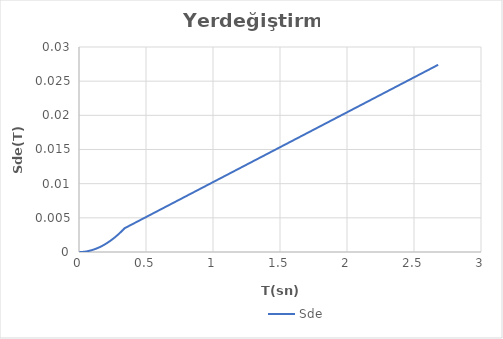
| Category | Sde |
|---|---|
| 0.0 | 0 |
| 0.004 | 0 |
| 0.008 | 0 |
| 0.012 | 0 |
| 0.016 | 0 |
| 0.02 | 0 |
| 0.024 | 0 |
| 0.028 | 0 |
| 0.032 | 0 |
| 0.036000000000000004 | 0 |
| 0.04000000000000001 | 0 |
| 0.04400000000000001 | 0 |
| 0.048000000000000015 | 0 |
| 0.05200000000000002 | 0 |
| 0.05600000000000002 | 0 |
| 0.060000000000000026 | 0 |
| 0.06400000000000003 | 0 |
| 0.06820486815415822 | 0 |
| 0.07200000000000004 | 0 |
| 0.07600000000000004 | 0 |
| 0.08000000000000004 | 0 |
| 0.08400000000000005 | 0 |
| 0.08800000000000005 | 0 |
| 0.09200000000000005 | 0 |
| 0.09600000000000006 | 0 |
| 0.10000000000000006 | 0 |
| 0.10400000000000006 | 0 |
| 0.10800000000000007 | 0 |
| 0.11200000000000007 | 0 |
| 0.11600000000000008 | 0 |
| 0.12000000000000008 | 0 |
| 0.12400000000000008 | 0 |
| 0.12800000000000009 | 0 |
| 0.1320000000000001 | 0.001 |
| 0.1360000000000001 | 0.001 |
| 0.1400000000000001 | 0.001 |
| 0.1440000000000001 | 0.001 |
| 0.1480000000000001 | 0.001 |
| 0.1520000000000001 | 0.001 |
| 0.1560000000000001 | 0.001 |
| 0.16000000000000011 | 0.001 |
| 0.16400000000000012 | 0.001 |
| 0.16800000000000012 | 0.001 |
| 0.17200000000000013 | 0.001 |
| 0.17600000000000013 | 0.001 |
| 0.18000000000000013 | 0.001 |
| 0.18400000000000014 | 0.001 |
| 0.18800000000000014 | 0.001 |
| 0.19200000000000014 | 0.001 |
| 0.19600000000000015 | 0.001 |
| 0.20000000000000015 | 0.001 |
| 0.20400000000000015 | 0.001 |
| 0.20800000000000016 | 0.001 |
| 0.21200000000000016 | 0.001 |
| 0.21600000000000016 | 0.001 |
| 0.22000000000000017 | 0.001 |
| 0.22400000000000017 | 0.002 |
| 0.22800000000000017 | 0.002 |
| 0.23200000000000018 | 0.002 |
| 0.23600000000000018 | 0.002 |
| 0.24000000000000019 | 0.002 |
| 0.2440000000000002 | 0.002 |
| 0.2480000000000002 | 0.002 |
| 0.25200000000000017 | 0.002 |
| 0.25600000000000017 | 0.002 |
| 0.2600000000000002 | 0.002 |
| 0.2640000000000002 | 0.002 |
| 0.2680000000000002 | 0.002 |
| 0.2720000000000002 | 0.002 |
| 0.2760000000000002 | 0.002 |
| 0.2800000000000002 | 0.002 |
| 0.2840000000000002 | 0.002 |
| 0.2880000000000002 | 0.002 |
| 0.2920000000000002 | 0.003 |
| 0.2960000000000002 | 0.003 |
| 0.3000000000000002 | 0.003 |
| 0.3040000000000002 | 0.003 |
| 0.3080000000000002 | 0.003 |
| 0.3120000000000002 | 0.003 |
| 0.3160000000000002 | 0.003 |
| 0.32000000000000023 | 0.003 |
| 0.32400000000000023 | 0.003 |
| 0.32800000000000024 | 0.003 |
| 0.33200000000000024 | 0.003 |
| 0.33600000000000024 | 0.003 |
| 0.3410243407707911 | 0.003 |
| 0.34400000000000025 | 0.004 |
| 0.34800000000000025 | 0.004 |
| 0.35200000000000026 | 0.004 |
| 0.35600000000000026 | 0.004 |
| 0.36000000000000026 | 0.004 |
| 0.36400000000000027 | 0.004 |
| 0.36800000000000027 | 0.004 |
| 0.3720000000000003 | 0.004 |
| 0.3760000000000003 | 0.004 |
| 0.3800000000000003 | 0.004 |
| 0.3840000000000003 | 0.004 |
| 0.3880000000000003 | 0.004 |
| 0.3920000000000003 | 0.004 |
| 0.3960000000000003 | 0.004 |
| 0.4000000000000003 | 0.004 |
| 0.4040000000000003 | 0.004 |
| 0.4080000000000003 | 0.004 |
| 0.4120000000000003 | 0.004 |
| 0.4160000000000003 | 0.004 |
| 0.4200000000000003 | 0.004 |
| 0.4240000000000003 | 0.004 |
| 0.4280000000000003 | 0.004 |
| 0.43200000000000033 | 0.004 |
| 0.43600000000000033 | 0.004 |
| 0.44000000000000034 | 0.004 |
| 0.44400000000000034 | 0.005 |
| 0.44800000000000034 | 0.005 |
| 0.45200000000000035 | 0.005 |
| 0.45600000000000035 | 0.005 |
| 0.46000000000000035 | 0.005 |
| 0.46400000000000036 | 0.005 |
| 0.46800000000000036 | 0.005 |
| 0.47200000000000036 | 0.005 |
| 0.47600000000000037 | 0.005 |
| 0.48000000000000037 | 0.005 |
| 0.4840000000000004 | 0.005 |
| 0.4880000000000004 | 0.005 |
| 0.4920000000000004 | 0.005 |
| 0.4960000000000004 | 0.005 |
| 0.5000000000000003 | 0.005 |
| 0.5040000000000003 | 0.005 |
| 0.5080000000000003 | 0.005 |
| 0.5120000000000003 | 0.005 |
| 0.5160000000000003 | 0.005 |
| 0.5200000000000004 | 0.005 |
| 0.5240000000000004 | 0.005 |
| 0.5280000000000004 | 0.005 |
| 0.5320000000000004 | 0.005 |
| 0.5360000000000004 | 0.005 |
| 0.5400000000000004 | 0.006 |
| 0.5440000000000004 | 0.006 |
| 0.5480000000000004 | 0.006 |
| 0.5520000000000004 | 0.006 |
| 0.5560000000000004 | 0.006 |
| 0.5600000000000004 | 0.006 |
| 0.5640000000000004 | 0.006 |
| 0.5680000000000004 | 0.006 |
| 0.5720000000000004 | 0.006 |
| 0.5760000000000004 | 0.006 |
| 0.5800000000000004 | 0.006 |
| 0.5840000000000004 | 0.006 |
| 0.5880000000000004 | 0.006 |
| 0.5920000000000004 | 0.006 |
| 0.5960000000000004 | 0.006 |
| 0.6000000000000004 | 0.006 |
| 0.6040000000000004 | 0.006 |
| 0.6080000000000004 | 0.006 |
| 0.6120000000000004 | 0.006 |
| 0.6160000000000004 | 0.006 |
| 0.6200000000000004 | 0.006 |
| 0.6240000000000004 | 0.006 |
| 0.6280000000000004 | 0.006 |
| 0.6320000000000005 | 0.006 |
| 0.6360000000000005 | 0.007 |
| 0.6400000000000005 | 0.007 |
| 0.6440000000000005 | 0.007 |
| 0.6480000000000005 | 0.007 |
| 0.6520000000000005 | 0.007 |
| 0.6560000000000005 | 0.007 |
| 0.6600000000000005 | 0.007 |
| 0.6640000000000005 | 0.007 |
| 0.6680000000000005 | 0.007 |
| 0.6720000000000005 | 0.007 |
| 0.6760000000000005 | 0.007 |
| 0.6800000000000005 | 0.007 |
| 0.6840000000000005 | 0.007 |
| 0.6880000000000005 | 0.007 |
| 0.6920000000000005 | 0.007 |
| 0.6960000000000005 | 0.007 |
| 0.7000000000000005 | 0.007 |
| 0.7040000000000005 | 0.007 |
| 0.7080000000000005 | 0.007 |
| 0.7120000000000005 | 0.007 |
| 0.7160000000000005 | 0.007 |
| 0.7200000000000005 | 0.007 |
| 0.7240000000000005 | 0.007 |
| 0.7280000000000005 | 0.007 |
| 0.7320000000000005 | 0.007 |
| 0.7360000000000005 | 0.008 |
| 0.7400000000000005 | 0.008 |
| 0.7440000000000005 | 0.008 |
| 0.7480000000000006 | 0.008 |
| 0.7520000000000006 | 0.008 |
| 0.7560000000000006 | 0.008 |
| 0.7600000000000006 | 0.008 |
| 0.7640000000000006 | 0.008 |
| 0.7680000000000006 | 0.008 |
| 0.7720000000000006 | 0.008 |
| 0.7760000000000006 | 0.008 |
| 0.7800000000000006 | 0.008 |
| 0.7840000000000006 | 0.008 |
| 0.7880000000000006 | 0.008 |
| 0.7920000000000006 | 0.008 |
| 0.7960000000000006 | 0.008 |
| 0.8000000000000006 | 0.008 |
| 0.8040000000000006 | 0.008 |
| 0.8080000000000006 | 0.008 |
| 0.8120000000000006 | 0.008 |
| 0.8160000000000006 | 0.008 |
| 0.8200000000000006 | 0.008 |
| 0.8240000000000006 | 0.008 |
| 0.8280000000000006 | 0.008 |
| 0.8320000000000006 | 0.009 |
| 0.8360000000000006 | 0.009 |
| 0.8400000000000006 | 0.009 |
| 0.8440000000000006 | 0.009 |
| 0.8480000000000006 | 0.009 |
| 0.8520000000000006 | 0.009 |
| 0.8560000000000006 | 0.009 |
| 0.8600000000000007 | 0.009 |
| 0.8640000000000007 | 0.009 |
| 0.8680000000000007 | 0.009 |
| 0.8720000000000007 | 0.009 |
| 0.8760000000000007 | 0.009 |
| 0.8800000000000007 | 0.009 |
| 0.8840000000000007 | 0.009 |
| 0.8880000000000007 | 0.009 |
| 0.8920000000000007 | 0.009 |
| 0.8960000000000007 | 0.009 |
| 0.9000000000000007 | 0.009 |
| 0.9040000000000007 | 0.009 |
| 0.9080000000000007 | 0.009 |
| 0.9120000000000007 | 0.009 |
| 0.9160000000000007 | 0.009 |
| 0.9200000000000007 | 0.009 |
| 0.9240000000000007 | 0.009 |
| 0.9280000000000007 | 0.009 |
| 0.9320000000000007 | 0.01 |
| 0.9360000000000007 | 0.01 |
| 0.9400000000000007 | 0.01 |
| 0.9440000000000007 | 0.01 |
| 0.9480000000000007 | 0.01 |
| 0.9520000000000007 | 0.01 |
| 0.9560000000000007 | 0.01 |
| 0.9600000000000007 | 0.01 |
| 0.9640000000000007 | 0.01 |
| 0.9680000000000007 | 0.01 |
| 0.9720000000000008 | 0.01 |
| 0.9760000000000008 | 0.01 |
| 0.9800000000000008 | 0.01 |
| 0.9840000000000008 | 0.01 |
| 0.9880000000000008 | 0.01 |
| 0.9920000000000008 | 0.01 |
| 0.9960000000000008 | 0.01 |
| 1.0 | 0.01 |
| 1.0040000000000007 | 0.01 |
| 1.0080000000000007 | 0.01 |
| 1.0120000000000007 | 0.01 |
| 1.0160000000000007 | 0.01 |
| 1.0200000000000007 | 0.01 |
| 1.0240000000000007 | 0.01 |
| 1.0280000000000007 | 0.011 |
| 1.0320000000000007 | 0.011 |
| 1.0360000000000007 | 0.011 |
| 1.0400000000000007 | 0.011 |
| 1.0440000000000007 | 0.011 |
| 1.0480000000000007 | 0.011 |
| 1.0520000000000007 | 0.011 |
| 1.0560000000000007 | 0.011 |
| 1.0600000000000007 | 0.011 |
| 1.0640000000000007 | 0.011 |
| 1.0680000000000007 | 0.011 |
| 1.0720000000000007 | 0.011 |
| 1.0760000000000007 | 0.011 |
| 1.0800000000000007 | 0.011 |
| 1.0840000000000007 | 0.011 |
| 1.0880000000000007 | 0.011 |
| 1.0920000000000007 | 0.011 |
| 1.0960000000000008 | 0.011 |
| 1.1000000000000008 | 0.011 |
| 1.1040000000000008 | 0.011 |
| 1.1080000000000008 | 0.011 |
| 1.1120000000000008 | 0.011 |
| 1.1160000000000008 | 0.011 |
| 1.1200000000000008 | 0.011 |
| 1.1240000000000008 | 0.011 |
| 1.1280000000000008 | 0.012 |
| 1.1320000000000008 | 0.012 |
| 1.1360000000000008 | 0.012 |
| 1.1400000000000008 | 0.012 |
| 1.1440000000000008 | 0.012 |
| 1.1480000000000008 | 0.012 |
| 1.1520000000000008 | 0.012 |
| 1.1560000000000008 | 0.012 |
| 1.1600000000000008 | 0.012 |
| 1.1640000000000008 | 0.012 |
| 1.1680000000000008 | 0.012 |
| 1.1720000000000008 | 0.012 |
| 1.1760000000000008 | 0.012 |
| 1.1800000000000008 | 0.012 |
| 1.1840000000000008 | 0.012 |
| 1.1880000000000008 | 0.012 |
| 1.1920000000000008 | 0.012 |
| 1.1960000000000008 | 0.012 |
| 1.2000000000000008 | 0.012 |
| 1.2040000000000008 | 0.012 |
| 1.2080000000000009 | 0.012 |
| 1.2120000000000009 | 0.012 |
| 1.2160000000000009 | 0.012 |
| 1.2200000000000009 | 0.012 |
| 1.2240000000000009 | 0.013 |
| 1.2280000000000009 | 0.013 |
| 1.2320000000000009 | 0.013 |
| 1.2360000000000009 | 0.013 |
| 1.2400000000000009 | 0.013 |
| 1.2440000000000009 | 0.013 |
| 1.2480000000000009 | 0.013 |
| 1.252000000000001 | 0.013 |
| 1.256000000000001 | 0.013 |
| 1.260000000000001 | 0.013 |
| 1.264000000000001 | 0.013 |
| 1.268000000000001 | 0.013 |
| 1.272000000000001 | 0.013 |
| 1.276000000000001 | 0.013 |
| 1.280000000000001 | 0.013 |
| 1.284000000000001 | 0.013 |
| 1.288000000000001 | 0.013 |
| 1.292000000000001 | 0.013 |
| 1.296000000000001 | 0.013 |
| 1.300000000000001 | 0.013 |
| 1.304000000000001 | 0.013 |
| 1.308000000000001 | 0.013 |
| 1.312000000000001 | 0.013 |
| 1.316000000000001 | 0.013 |
| 1.320000000000001 | 0.013 |
| 1.324000000000001 | 0.014 |
| 1.328000000000001 | 0.014 |
| 1.332000000000001 | 0.014 |
| 1.336000000000001 | 0.014 |
| 1.340000000000001 | 0.014 |
| 1.344000000000001 | 0.014 |
| 1.348000000000001 | 0.014 |
| 1.352000000000001 | 0.014 |
| 1.356000000000001 | 0.014 |
| 1.360000000000001 | 0.014 |
| 1.364000000000001 | 0.014 |
| 1.368000000000001 | 0.014 |
| 1.372000000000001 | 0.014 |
| 1.376000000000001 | 0.014 |
| 1.380000000000001 | 0.014 |
| 1.384000000000001 | 0.014 |
| 1.388000000000001 | 0.014 |
| 1.392000000000001 | 0.014 |
| 1.396000000000001 | 0.014 |
| 1.400000000000001 | 0.014 |
| 1.404000000000001 | 0.014 |
| 1.408000000000001 | 0.014 |
| 1.412000000000001 | 0.014 |
| 1.416000000000001 | 0.014 |
| 1.420000000000001 | 0.015 |
| 1.424000000000001 | 0.015 |
| 1.428000000000001 | 0.015 |
| 1.432000000000001 | 0.015 |
| 1.436000000000001 | 0.015 |
| 1.440000000000001 | 0.015 |
| 1.444000000000001 | 0.015 |
| 1.448000000000001 | 0.015 |
| 1.452000000000001 | 0.015 |
| 1.456000000000001 | 0.015 |
| 1.460000000000001 | 0.015 |
| 1.464000000000001 | 0.015 |
| 1.468000000000001 | 0.015 |
| 1.472000000000001 | 0.015 |
| 1.476000000000001 | 0.015 |
| 1.480000000000001 | 0.015 |
| 1.484000000000001 | 0.015 |
| 1.488000000000001 | 0.015 |
| 1.492000000000001 | 0.015 |
| 1.496000000000001 | 0.015 |
| 1.500000000000001 | 0.015 |
| 1.5040000000000011 | 0.015 |
| 1.5080000000000011 | 0.015 |
| 1.5120000000000011 | 0.015 |
| 1.5160000000000011 | 0.015 |
| 1.5200000000000011 | 0.016 |
| 1.5240000000000011 | 0.016 |
| 1.5280000000000011 | 0.016 |
| 1.5320000000000011 | 0.016 |
| 1.5360000000000011 | 0.016 |
| 1.5400000000000011 | 0.016 |
| 1.5440000000000011 | 0.016 |
| 1.5480000000000012 | 0.016 |
| 1.5520000000000012 | 0.016 |
| 1.5560000000000012 | 0.016 |
| 1.5600000000000012 | 0.016 |
| 1.5640000000000012 | 0.016 |
| 1.5680000000000012 | 0.016 |
| 1.5720000000000012 | 0.016 |
| 1.5760000000000012 | 0.016 |
| 1.5800000000000012 | 0.016 |
| 1.5840000000000012 | 0.016 |
| 1.5880000000000012 | 0.016 |
| 1.5920000000000012 | 0.016 |
| 1.5960000000000012 | 0.016 |
| 1.6000000000000012 | 0.016 |
| 1.6040000000000012 | 0.016 |
| 1.6080000000000012 | 0.016 |
| 1.6120000000000012 | 0.016 |
| 1.6160000000000012 | 0.017 |
| 1.6200000000000012 | 0.017 |
| 1.6240000000000012 | 0.017 |
| 1.6280000000000012 | 0.017 |
| 1.6320000000000012 | 0.017 |
| 1.6360000000000012 | 0.017 |
| 1.6400000000000012 | 0.017 |
| 1.6440000000000012 | 0.017 |
| 1.6480000000000012 | 0.017 |
| 1.6520000000000012 | 0.017 |
| 1.6560000000000012 | 0.017 |
| 1.6600000000000013 | 0.017 |
| 1.6640000000000013 | 0.017 |
| 1.6680000000000013 | 0.017 |
| 1.6720000000000013 | 0.017 |
| 1.6760000000000013 | 0.017 |
| 1.6800000000000013 | 0.017 |
| 1.6840000000000013 | 0.017 |
| 1.6880000000000013 | 0.017 |
| 1.6920000000000013 | 0.017 |
| 1.6960000000000013 | 0.017 |
| 1.7000000000000013 | 0.017 |
| 1.7040000000000013 | 0.017 |
| 1.7080000000000013 | 0.017 |
| 1.7120000000000013 | 0.017 |
| 1.7160000000000013 | 0.018 |
| 1.7200000000000013 | 0.018 |
| 1.7240000000000013 | 0.018 |
| 1.7280000000000013 | 0.018 |
| 1.7320000000000013 | 0.018 |
| 1.7360000000000013 | 0.018 |
| 1.7400000000000013 | 0.018 |
| 1.7440000000000013 | 0.018 |
| 1.7480000000000013 | 0.018 |
| 1.7520000000000013 | 0.018 |
| 1.7560000000000013 | 0.018 |
| 1.7600000000000013 | 0.018 |
| 1.7640000000000013 | 0.018 |
| 1.7680000000000013 | 0.018 |
| 1.7720000000000014 | 0.018 |
| 1.7760000000000014 | 0.018 |
| 1.7800000000000014 | 0.018 |
| 1.7840000000000014 | 0.018 |
| 1.7880000000000014 | 0.018 |
| 1.7920000000000014 | 0.018 |
| 1.7960000000000014 | 0.018 |
| 1.8000000000000014 | 0.018 |
| 1.8040000000000014 | 0.018 |
| 1.8080000000000014 | 0.018 |
| 1.8120000000000014 | 0.019 |
| 1.8160000000000014 | 0.019 |
| 1.8200000000000014 | 0.019 |
| 1.8240000000000014 | 0.019 |
| 1.8280000000000014 | 0.019 |
| 1.8320000000000014 | 0.019 |
| 1.8360000000000014 | 0.019 |
| 1.8400000000000014 | 0.019 |
| 1.8440000000000014 | 0.019 |
| 1.8480000000000014 | 0.019 |
| 1.8520000000000014 | 0.019 |
| 1.8560000000000014 | 0.019 |
| 1.8600000000000014 | 0.019 |
| 1.8640000000000014 | 0.019 |
| 1.8680000000000014 | 0.019 |
| 1.8720000000000014 | 0.019 |
| 1.8760000000000014 | 0.019 |
| 1.8800000000000014 | 0.019 |
| 1.8840000000000015 | 0.019 |
| 1.8880000000000015 | 0.019 |
| 1.8920000000000015 | 0.019 |
| 1.8960000000000015 | 0.019 |
| 1.9000000000000015 | 0.019 |
| 1.9040000000000015 | 0.019 |
| 1.9080000000000015 | 0.02 |
| 1.9120000000000015 | 0.02 |
| 1.9160000000000015 | 0.02 |
| 1.9200000000000015 | 0.02 |
| 1.9240000000000015 | 0.02 |
| 1.9280000000000015 | 0.02 |
| 1.9320000000000015 | 0.02 |
| 1.9360000000000015 | 0.02 |
| 1.9400000000000015 | 0.02 |
| 1.9440000000000015 | 0.02 |
| 1.9480000000000015 | 0.02 |
| 1.9520000000000015 | 0.02 |
| 1.9560000000000015 | 0.02 |
| 1.9600000000000015 | 0.02 |
| 1.9640000000000015 | 0.02 |
| 1.9680000000000015 | 0.02 |
| 1.9720000000000015 | 0.02 |
| 1.9760000000000015 | 0.02 |
| 1.9800000000000015 | 0.02 |
| 1.9840000000000015 | 0.02 |
| 1.9880000000000015 | 0.02 |
| 1.9920000000000015 | 0.02 |
| 1.9960000000000016 | 0.02 |
| 2.0000000000000013 | 0.02 |
| 2.0040000000000013 | 0.02 |
| 2.0080000000000013 | 0.021 |
| 2.0120000000000013 | 0.021 |
| 2.0160000000000013 | 0.021 |
| 2.0200000000000014 | 0.021 |
| 2.0240000000000014 | 0.021 |
| 2.0280000000000014 | 0.021 |
| 2.0320000000000014 | 0.021 |
| 2.0360000000000014 | 0.021 |
| 2.0400000000000014 | 0.021 |
| 2.0440000000000014 | 0.021 |
| 2.0480000000000014 | 0.021 |
| 2.0520000000000014 | 0.021 |
| 2.0560000000000014 | 0.021 |
| 2.0600000000000014 | 0.021 |
| 2.0640000000000014 | 0.021 |
| 2.0680000000000014 | 0.021 |
| 2.0720000000000014 | 0.021 |
| 2.0760000000000014 | 0.021 |
| 2.0800000000000014 | 0.021 |
| 2.0840000000000014 | 0.021 |
| 2.0880000000000014 | 0.021 |
| 2.0920000000000014 | 0.021 |
| 2.0960000000000014 | 0.021 |
| 2.1000000000000014 | 0.021 |
| 2.1040000000000014 | 0.022 |
| 2.1080000000000014 | 0.022 |
| 2.1120000000000014 | 0.022 |
| 2.1160000000000014 | 0.022 |
| 2.1200000000000014 | 0.022 |
| 2.1240000000000014 | 0.022 |
| 2.1280000000000014 | 0.022 |
| 2.1320000000000014 | 0.022 |
| 2.1360000000000015 | 0.022 |
| 2.1400000000000015 | 0.022 |
| 2.1440000000000015 | 0.022 |
| 2.1480000000000015 | 0.022 |
| 2.1520000000000015 | 0.022 |
| 2.1560000000000015 | 0.022 |
| 2.1600000000000015 | 0.022 |
| 2.1640000000000015 | 0.022 |
| 2.1680000000000015 | 0.022 |
| 2.1720000000000015 | 0.022 |
| 2.1760000000000015 | 0.022 |
| 2.1800000000000015 | 0.022 |
| 2.1840000000000015 | 0.022 |
| 2.1880000000000015 | 0.022 |
| 2.1920000000000015 | 0.022 |
| 2.1960000000000015 | 0.022 |
| 2.2000000000000015 | 0.022 |
| 2.2040000000000015 | 0.023 |
| 2.2080000000000015 | 0.023 |
| 2.2120000000000015 | 0.023 |
| 2.2160000000000015 | 0.023 |
| 2.2200000000000015 | 0.023 |
| 2.2240000000000015 | 0.023 |
| 2.2280000000000015 | 0.023 |
| 2.2320000000000015 | 0.023 |
| 2.2360000000000015 | 0.023 |
| 2.2400000000000015 | 0.023 |
| 2.2440000000000015 | 0.023 |
| 2.2480000000000016 | 0.023 |
| 2.2520000000000016 | 0.023 |
| 2.2560000000000016 | 0.023 |
| 2.2600000000000016 | 0.023 |
| 2.2640000000000016 | 0.023 |
| 2.2680000000000016 | 0.023 |
| 2.2720000000000016 | 0.023 |
| 2.2760000000000016 | 0.023 |
| 2.2800000000000016 | 0.023 |
| 2.2840000000000016 | 0.023 |
| 2.2880000000000016 | 0.023 |
| 2.2920000000000016 | 0.023 |
| 2.2960000000000016 | 0.023 |
| 2.3000000000000016 | 0.024 |
| 2.3040000000000016 | 0.024 |
| 2.3080000000000016 | 0.024 |
| 2.3120000000000016 | 0.024 |
| 2.3160000000000016 | 0.024 |
| 2.3200000000000016 | 0.024 |
| 2.3240000000000016 | 0.024 |
| 2.3280000000000016 | 0.024 |
| 2.3320000000000016 | 0.024 |
| 2.3360000000000016 | 0.024 |
| 2.3400000000000016 | 0.024 |
| 2.3440000000000016 | 0.024 |
| 2.3480000000000016 | 0.024 |
| 2.3520000000000016 | 0.024 |
| 2.3560000000000016 | 0.024 |
| 2.3600000000000017 | 0.024 |
| 2.3640000000000017 | 0.024 |
| 2.3680000000000017 | 0.024 |
| 2.3720000000000017 | 0.024 |
| 2.3760000000000017 | 0.024 |
| 2.3800000000000017 | 0.024 |
| 2.3840000000000017 | 0.024 |
| 2.3880000000000017 | 0.024 |
| 2.3920000000000017 | 0.024 |
| 2.3960000000000017 | 0.024 |
| 2.4000000000000017 | 0.025 |
| 2.4040000000000017 | 0.025 |
| 2.4080000000000017 | 0.025 |
| 2.4120000000000017 | 0.025 |
| 2.4160000000000017 | 0.025 |
| 2.4200000000000017 | 0.025 |
| 2.4240000000000017 | 0.025 |
| 2.4280000000000017 | 0.025 |
| 2.4320000000000017 | 0.025 |
| 2.4360000000000017 | 0.025 |
| 2.4400000000000017 | 0.025 |
| 2.4440000000000017 | 0.025 |
| 2.4480000000000017 | 0.025 |
| 2.4520000000000017 | 0.025 |
| 2.4560000000000017 | 0.025 |
| 2.4600000000000017 | 0.025 |
| 2.4640000000000017 | 0.025 |
| 2.4680000000000017 | 0.025 |
| 2.4720000000000018 | 0.025 |
| 2.4760000000000018 | 0.025 |
| 2.4800000000000018 | 0.025 |
| 2.4840000000000018 | 0.025 |
| 2.4880000000000018 | 0.025 |
| 2.4920000000000018 | 0.025 |
| 2.4960000000000018 | 0.026 |
| 2.5000000000000018 | 0.026 |
| 2.504000000000002 | 0.026 |
| 2.508000000000002 | 0.026 |
| 2.512000000000002 | 0.026 |
| 2.516000000000002 | 0.026 |
| 2.520000000000002 | 0.026 |
| 2.524000000000002 | 0.026 |
| 2.528000000000002 | 0.026 |
| 2.532000000000002 | 0.026 |
| 2.536000000000002 | 0.026 |
| 2.540000000000002 | 0.026 |
| 2.544000000000002 | 0.026 |
| 2.548000000000002 | 0.026 |
| 2.552000000000002 | 0.026 |
| 2.556000000000002 | 0.026 |
| 2.560000000000002 | 0.026 |
| 2.564000000000002 | 0.026 |
| 2.568000000000002 | 0.026 |
| 2.572000000000002 | 0.026 |
| 2.576000000000002 | 0.026 |
| 2.580000000000002 | 0.026 |
| 2.584000000000002 | 0.026 |
| 2.588000000000002 | 0.026 |
| 2.592000000000002 | 0.026 |
| 2.596000000000002 | 0.027 |
| 2.600000000000002 | 0.027 |
| 2.604000000000002 | 0.027 |
| 2.608000000000002 | 0.027 |
| 2.612000000000002 | 0.027 |
| 2.616000000000002 | 0.027 |
| 2.620000000000002 | 0.027 |
| 2.624000000000002 | 0.027 |
| 2.628000000000002 | 0.027 |
| 2.632000000000002 | 0.027 |
| 2.636000000000002 | 0.027 |
| 2.640000000000002 | 0.027 |
| 2.644000000000002 | 0.027 |
| 2.648000000000002 | 0.027 |
| 2.652000000000002 | 0.027 |
| 2.656000000000002 | 0.027 |
| 2.660000000000002 | 0.027 |
| 2.664000000000002 | 0.027 |
| 2.668000000000002 | 0.027 |
| 2.672000000000002 | 0.027 |
| 2.676000000000002 | 0.027 |
| 2.680000000000002 | 0.027 |